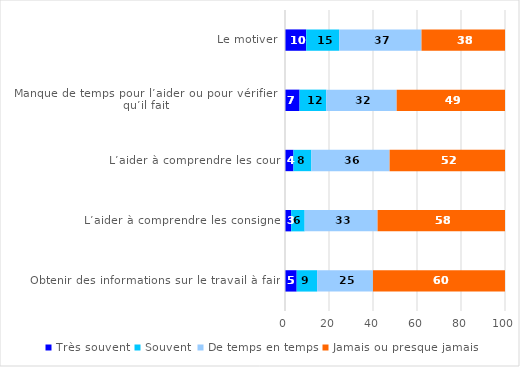
| Category | Très souvent | Souvent | De temps en temps | Jamais ou presque jamais |
|---|---|---|---|---|
| Le motiver | 9.64 | 15.01 | 37.4 | 37.96 |
| Manque de temps pour l’aider ou pour vérifier ce qu’il fait | 6.62 | 12.14 | 32 | 49.24 |
| L’aider à comprendre les cours | 3.85 | 8.14 | 35.56 | 52.45 |
| L’aider à comprendre les consignes | 2.8 | 6.13 | 33.15 | 57.92 |
| Obtenir des informations sur le travail à faire. | 5.31 | 9.3 | 25.36 | 60.02 |